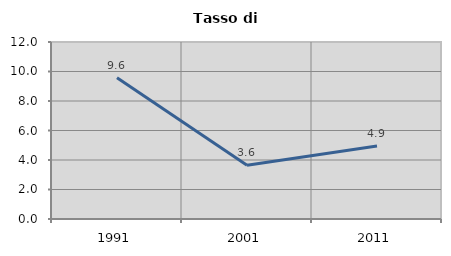
| Category | Tasso di disoccupazione   |
|---|---|
| 1991.0 | 9.577 |
| 2001.0 | 3.639 |
| 2011.0 | 4.945 |